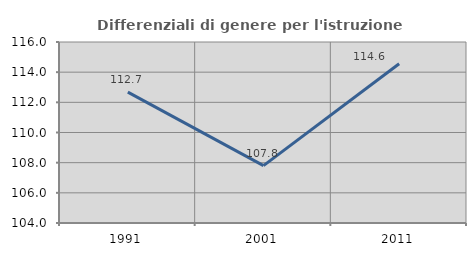
| Category | Differenziali di genere per l'istruzione superiore |
|---|---|
| 1991.0 | 112.68 |
| 2001.0 | 107.806 |
| 2011.0 | 114.561 |